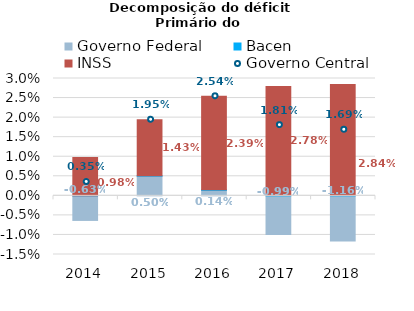
| Category | Governo Federal | Bacen | INSS |
|---|---|---|---|
| 2014.0 | -0.006 | 0 | 0.01 |
| 2015.0 | 0.005 | 0 | 0.014 |
| 2016.0 | 0.001 | 0 | 0.024 |
| 2017.0 | -0.01 | 0 | 0.028 |
| 2018.0 | -0.012 | 0 | 0.028 |